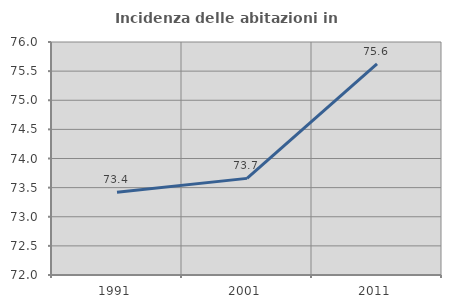
| Category | Incidenza delle abitazioni in proprietà  |
|---|---|
| 1991.0 | 73.421 |
| 2001.0 | 73.659 |
| 2011.0 | 75.623 |